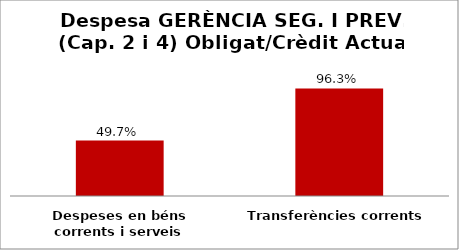
| Category | Series 0 |
|---|---|
| Despeses en béns corrents i serveis | 0.497 |
| Transferències corrents | 0.963 |